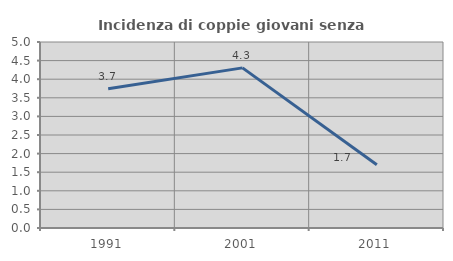
| Category | Incidenza di coppie giovani senza figli |
|---|---|
| 1991.0 | 3.745 |
| 2001.0 | 4.305 |
| 2011.0 | 1.701 |